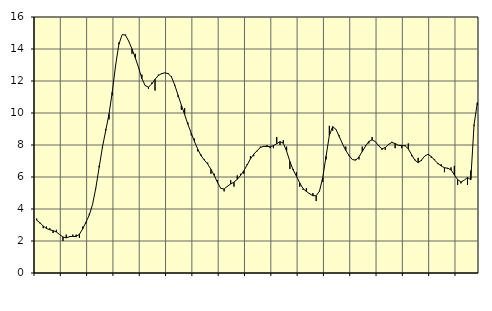
| Category | Piggar | Series 1 |
|---|---|---|
| nan | 3.4 | 3.3 |
| 87.0 | 3.1 | 3.14 |
| 87.0 | 2.8 | 2.94 |
| 87.0 | 2.9 | 2.78 |
| nan | 2.8 | 2.7 |
| 88.0 | 2.5 | 2.65 |
| 88.0 | 2.7 | 2.56 |
| 88.0 | 2.4 | 2.4 |
| nan | 2 | 2.25 |
| 89.0 | 2.4 | 2.2 |
| 89.0 | 2.3 | 2.27 |
| 89.0 | 2.4 | 2.29 |
| nan | 2.4 | 2.28 |
| 90.0 | 2.2 | 2.42 |
| 90.0 | 2.9 | 2.76 |
| 90.0 | 3.1 | 3.18 |
| nan | 3.7 | 3.62 |
| 91.0 | 4.3 | 4.29 |
| 91.0 | 5.3 | 5.32 |
| 91.0 | 6.7 | 6.6 |
| nan | 7.8 | 7.86 |
| 92.0 | 9 | 8.9 |
| 92.0 | 9.6 | 9.93 |
| 92.0 | 11.1 | 11.32 |
| nan | 13 | 12.96 |
| 93.0 | 14.4 | 14.29 |
| 93.0 | 14.9 | 14.9 |
| 93.0 | 14.9 | 14.87 |
| nan | 14.5 | 14.49 |
| 94.0 | 13.7 | 14 |
| 94.0 | 13.7 | 13.45 |
| 94.0 | 12.8 | 12.83 |
| nan | 12.4 | 12.16 |
| 95.0 | 11.7 | 11.71 |
| 95.0 | 11.5 | 11.62 |
| 95.0 | 11.9 | 11.81 |
| nan | 11.4 | 12.11 |
| 96.0 | 12.4 | 12.34 |
| 96.0 | 12.5 | 12.46 |
| 96.0 | 12.5 | 12.51 |
| nan | 12.5 | 12.46 |
| 97.0 | 12.3 | 12.25 |
| 97.0 | 11.7 | 11.74 |
| 97.0 | 11 | 11.11 |
| nan | 10.2 | 10.5 |
| 98.0 | 10.3 | 9.9 |
| 98.0 | 9.4 | 9.29 |
| 98.0 | 8.6 | 8.74 |
| nan | 8.4 | 8.21 |
| 99.0 | 7.6 | 7.73 |
| 99.0 | 7.4 | 7.33 |
| 99.0 | 7.1 | 7.05 |
| nan | 6.9 | 6.81 |
| 0.0 | 6.2 | 6.48 |
| 0.0 | 6.2 | 6.1 |
| 0.0 | 5.8 | 5.65 |
| nan | 5.3 | 5.29 |
| 1.0 | 5.1 | 5.25 |
| 1.0 | 5.4 | 5.42 |
| 1.0 | 5.8 | 5.56 |
| nan | 5.4 | 5.68 |
| 2.0 | 6.1 | 5.85 |
| 2.0 | 6.2 | 6.1 |
| 2.0 | 6.2 | 6.39 |
| nan | 6.8 | 6.75 |
| 3.0 | 7.3 | 7.13 |
| 3.0 | 7.3 | 7.42 |
| 3.0 | 7.6 | 7.64 |
| nan | 7.9 | 7.84 |
| 4.0 | 7.9 | 7.92 |
| 4.0 | 8 | 7.91 |
| 4.0 | 7.8 | 7.89 |
| nan | 7.8 | 7.96 |
| 5.0 | 8.5 | 8.08 |
| 5.0 | 8 | 8.21 |
| 5.0 | 8.3 | 8.11 |
| nan | 7.9 | 7.62 |
| 6.0 | 6.5 | 6.97 |
| 6.0 | 6.5 | 6.44 |
| 6.0 | 6.3 | 6.05 |
| nan | 5.4 | 5.63 |
| 7.0 | 5.2 | 5.27 |
| 7.0 | 5.3 | 5.1 |
| 7.0 | 5 | 4.95 |
| nan | 5 | 4.83 |
| 8.0 | 4.5 | 4.83 |
| 8.0 | 5.1 | 5.12 |
| 8.0 | 5.7 | 5.97 |
| nan | 7.1 | 7.3 |
| 9.0 | 9.2 | 8.6 |
| 9.0 | 8.9 | 9.15 |
| 9.0 | 9 | 8.98 |
| nan | 8.6 | 8.53 |
| 10.0 | 8.1 | 8.07 |
| 10.0 | 7.9 | 7.66 |
| 10.0 | 7.3 | 7.34 |
| nan | 7.1 | 7.09 |
| 11.0 | 7.1 | 7.05 |
| 11.0 | 7.1 | 7.26 |
| 11.0 | 7.9 | 7.59 |
| nan | 8 | 7.93 |
| 12.0 | 8.1 | 8.22 |
| 12.0 | 8.5 | 8.32 |
| 12.0 | 8.2 | 8.21 |
| nan | 8 | 7.94 |
| 13.0 | 7.7 | 7.76 |
| 13.0 | 7.7 | 7.84 |
| 13.0 | 8 | 8.04 |
| nan | 8.2 | 8.16 |
| 14.0 | 7.8 | 8.09 |
| 14.0 | 8 | 7.98 |
| 14.0 | 7.8 | 7.97 |
| nan | 8 | 7.95 |
| 15.0 | 8.1 | 7.76 |
| 15.0 | 7.3 | 7.4 |
| 15.0 | 7.1 | 7.05 |
| nan | 7.2 | 6.9 |
| 16.0 | 7 | 7.05 |
| 16.0 | 7.3 | 7.31 |
| 16.0 | 7.4 | 7.42 |
| nan | 7.2 | 7.28 |
| 17.0 | 7.1 | 7.05 |
| 17.0 | 6.8 | 6.85 |
| 17.0 | 6.8 | 6.69 |
| nan | 6.3 | 6.58 |
| 18.0 | 6.5 | 6.55 |
| 18.0 | 6.6 | 6.44 |
| 18.0 | 6.7 | 6.14 |
| nan | 5.5 | 5.84 |
| 19.0 | 5.6 | 5.69 |
| 19.0 | 5.8 | 5.8 |
| 19.0 | 5.5 | 5.97 |
| nan | 6.4 | 5.83 |
| 20.0 | 9.2 | 9.27 |
| 20.0 | 10.5 | 10.65 |